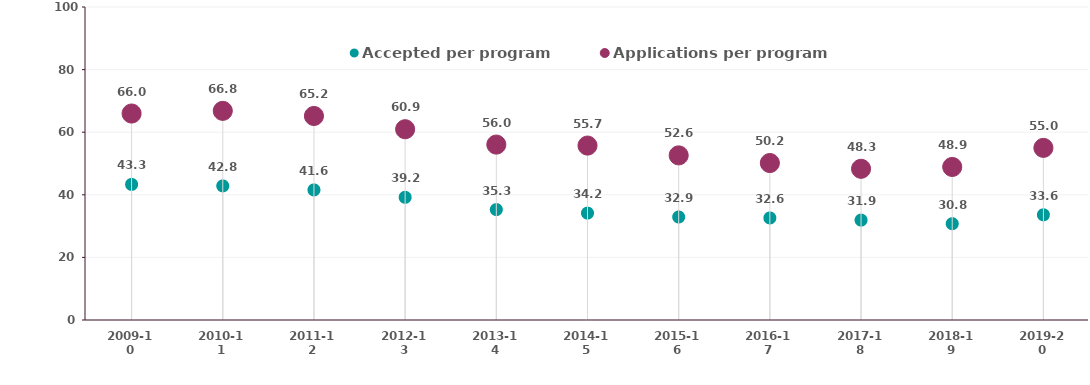
| Category | Accepted per program | Applications per program |
|---|---|---|
| 2009-10 | 43.314 | 65.968 |
| 2010-11 | 42.839 | 66.817 |
| 2011-12 | 41.557 | 65.181 |
| 2012-13 | 39.198 | 60.95 |
| 2013-14 | 35.275 | 56.044 |
| 2014-15 | 34.154 | 55.724 |
| 2015-16 | 32.909 | 52.597 |
| 2016-17 | 32.599 | 50.152 |
| 2017-18 | 31.913 | 48.304 |
| 2018-19 | 30.764 | 48.894 |
| 2019-20 | 33.612 | 54.992 |